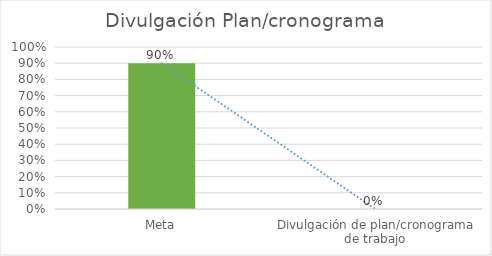
| Category | Series 0 |
|---|---|
| Meta | 0.9 |
| Divulgación de plan/cronograma de trabajo | 0 |